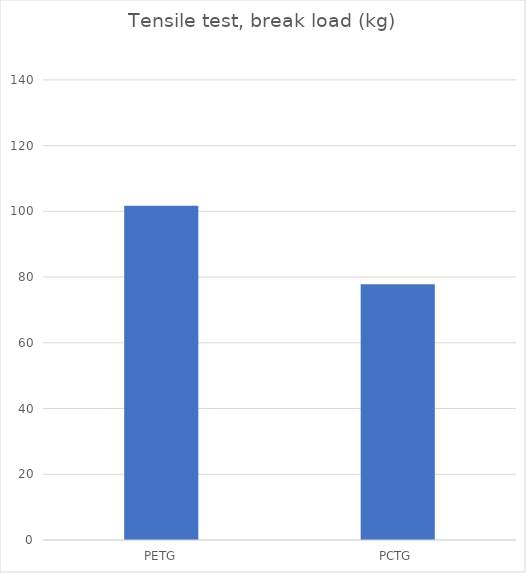
| Category | Average |
|---|---|
| PETG | 101.7 |
| PCTG | 77.8 |